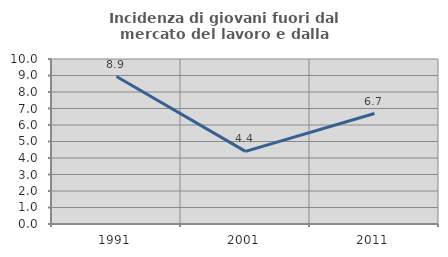
| Category | Incidenza di giovani fuori dal mercato del lavoro e dalla formazione  |
|---|---|
| 1991.0 | 8.938 |
| 2001.0 | 4.399 |
| 2011.0 | 6.696 |